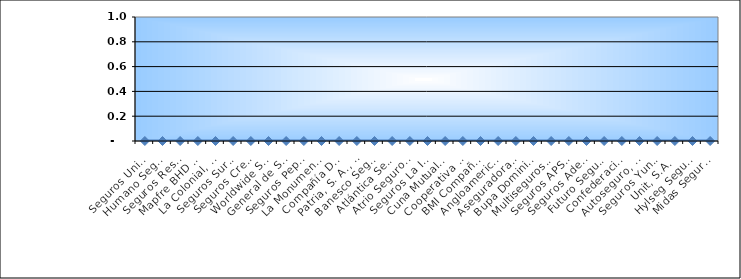
| Category | Series 0 |
|---|---|
| Seguros Universal, S. A. | 0 |
| Humano Seguros, S. A. | 0 |
| Seguros Reservas, S. A. | 0 |
| Mapfre BHD Compañía de Seguros | 0 |
| La Colonial, S. A., Compañia De Seguros | 0 |
| Seguros Sura, S.A. | 0 |
| Seguros Crecer, S. A. | 0 |
| Worldwide Seguros, S. A. | 0 |
| General de Seguros, S. A. | 0 |
| Seguros Pepín, S. A. | 0 |
| La Monumental de Seguros, S. A. | 0 |
| Compañía Dominicana de Seguros, C. por A. | 0 |
| Patria, S. A., Compañía de Seguros | 0 |
| Banesco Seguros | 0 |
| Atlántica Seguros, S. A. | 0 |
| Atrio Seguros S. A. | 0 |
| Seguros La Internacional, S. A. | 0 |
| Cuna Mutual Insurance Society Dominicana | 0 |
| Cooperativa Nacional De Seguros, Inc  | 0 |
| BMI Compañía de Seguros, S. A. | 0 |
| Angloamericana de Seguros, S. A. | 0 |
| Aseguradora Agropecuaria Dominicana, S. A. | 0 |
| Bupa Dominicana, S. A. | 0 |
| Multiseguros Su, S.A. | 0 |
| Seguros APS, S.R.L. | 0 |
| Seguros Ademi, S.A. | 0 |
| Futuro Seguros | 0 |
| Confederación del Canadá Dominicana, S. A. | 0 |
| Autoseguro, S. A. | 0 |
| Seguros Yunen, S.A. | 0 |
| Unit, S.A. | 0 |
| Hylseg Seguros S.A | 0 |
| Midas Seguros, S.A. | 0 |